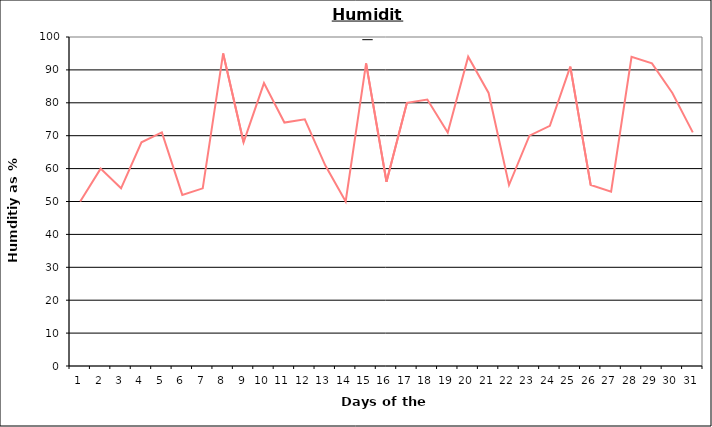
| Category | Series 0 |
|---|---|
| 0 | 50 |
| 1 | 60 |
| 2 | 54 |
| 3 | 68 |
| 4 | 71 |
| 5 | 52 |
| 6 | 54 |
| 7 | 95 |
| 8 | 68 |
| 9 | 86 |
| 10 | 74 |
| 11 | 75 |
| 12 | 61 |
| 13 | 50 |
| 14 | 92 |
| 15 | 56 |
| 16 | 80 |
| 17 | 81 |
| 18 | 71 |
| 19 | 94 |
| 20 | 83 |
| 21 | 55 |
| 22 | 70 |
| 23 | 73 |
| 24 | 91 |
| 25 | 55 |
| 26 | 53 |
| 27 | 94 |
| 28 | 92 |
| 29 | 83 |
| 30 | 71 |